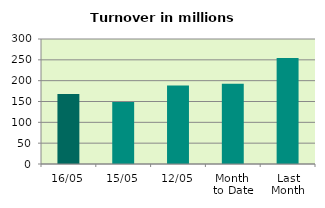
| Category | Series 0 |
|---|---|
| 16/05 | 167.877 |
| 15/05 | 148.63 |
| 12/05 | 188.655 |
| Month 
to Date | 192.648 |
| Last
Month | 254.458 |